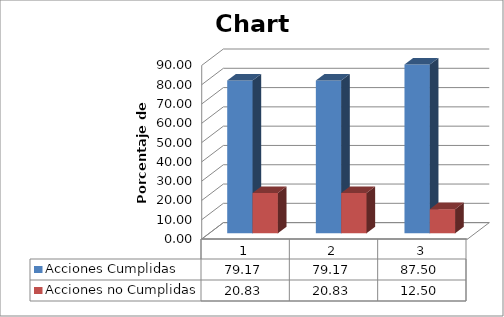
| Category | Acciones Cumplidas | Acciones no Cumplidas |
|---|---|---|
| 0 | 79.167 | 20.833 |
| 1 | 79.167 | 20.833 |
| 2 | 87.5 | 12.5 |